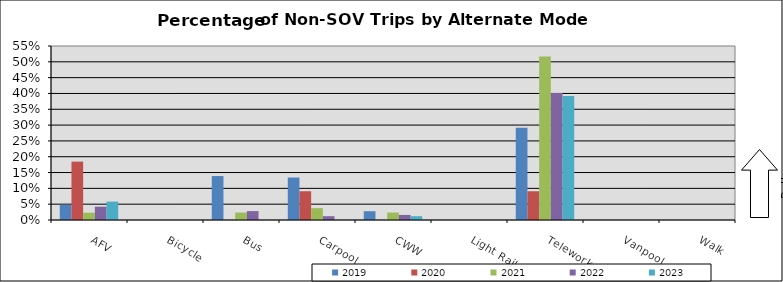
| Category | 2019 | 2020 | 2021 | 2022 | 2023 |
|---|---|---|---|---|---|
| AFV | 0.048 | 0.185 | 0.023 | 0.042 | 0.058 |
| Bicycle | 0 | 0 | 0 | 0 | 0 |
| Bus | 0.139 | 0 | 0.023 | 0.028 | 0 |
| Carpool | 0.134 | 0.091 | 0.038 | 0.012 | 0 |
| CWW | 0.028 | 0 | 0.023 | 0.016 | 0.012 |
| Light Rail | 0 | 0 | 0 | 0 | 0 |
| Telework | 0.292 | 0.091 | 0.516 | 0.402 | 0.392 |
| Vanpool | 0 | 0 | 0 | 0 | 0 |
| Walk | 0 | 0 | 0 | 0 | 0 |